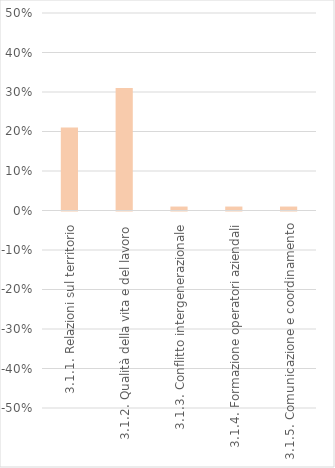
| Category | Series 0 |
|---|---|
| 3.1.1. Relazioni sul territorio | 0.21 |
| 3.1.2. Qualità della vita e del lavoro | 0.31 |
| 3.1.3. Conflitto intergenerazionale | 0.01 |
| 3.1.4. Formazione operatori aziendali | 0.01 |
| 3.1.5. Comunicazione e coordinamento | 0.01 |